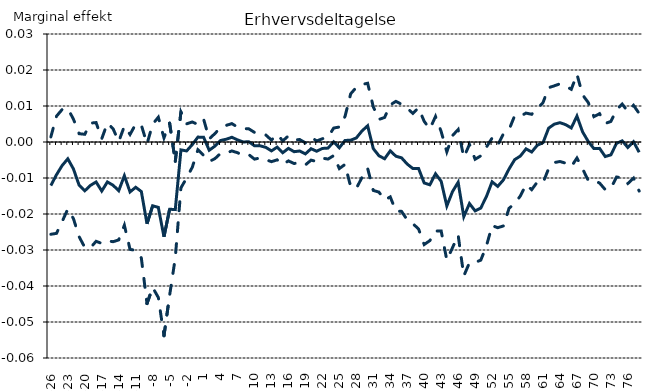
| Category | Estimat | Nedre konfidensgrænse | Øvre konfidensgrænse |
|---|---|---|---|
| -26.0 | -0.012 | -0.026 | 0.001 |
| -25.0 | -0.009 | -0.025 | 0.007 |
| -24.0 | -0.007 | -0.022 | 0.009 |
| -23.0 | -0.005 | -0.019 | 0.009 |
| -22.0 | -0.007 | -0.021 | 0.006 |
| -21.0 | -0.012 | -0.026 | 0.002 |
| -20.0 | -0.014 | -0.029 | 0.002 |
| -19.0 | -0.012 | -0.029 | 0.005 |
| -18.0 | -0.011 | -0.028 | 0.005 |
| -17.0 | -0.014 | -0.028 | 0.001 |
| -16.0 | -0.011 | -0.027 | 0.005 |
| -15.0 | -0.012 | -0.028 | 0.004 |
| -14.0 | -0.014 | -0.027 | 0 |
| -13.0 | -0.009 | -0.023 | 0.004 |
| -12.0 | -0.014 | -0.03 | 0.002 |
| -11.0 | -0.013 | -0.03 | 0.005 |
| -10.0 | -0.014 | -0.032 | 0.005 |
| -9.0 | -0.023 | -0.045 | -0.001 |
| -8.0 | -0.018 | -0.04 | 0.005 |
| -7.0 | -0.018 | -0.043 | 0.007 |
| -6.0 | -0.026 | -0.054 | 0.001 |
| -5.0 | -0.019 | -0.043 | 0.005 |
| -4.0 | -0.019 | -0.032 | -0.005 |
| -3.0 | -0.002 | -0.013 | 0.008 |
| -2.0 | -0.002 | -0.01 | 0.005 |
| -1.0 | -0.001 | -0.007 | 0.006 |
| 0.0 | 0.001 | -0.002 | 0.005 |
| 1.0 | 0.001 | -0.004 | 0.006 |
| 2.0 | -0.002 | -0.005 | 0.001 |
| 3.0 | -0.001 | -0.005 | 0.002 |
| 4.0 | 0 | -0.003 | 0.004 |
| 5.0 | 0.001 | -0.003 | 0.005 |
| 6.0 | 0.001 | -0.002 | 0.005 |
| 7.0 | 0.001 | -0.003 | 0.004 |
| 8.0 | 0 | -0.004 | 0.004 |
| 9.0 | 0 | -0.004 | 0.004 |
| 10.0 | -0.001 | -0.005 | 0.003 |
| 11.0 | -0.001 | -0.004 | 0.002 |
| 12.0 | -0.001 | -0.005 | 0.002 |
| 13.0 | -0.002 | -0.005 | 0.001 |
| 14.0 | -0.001 | -0.005 | 0.002 |
| 15.0 | -0.003 | -0.006 | 0 |
| 16.0 | -0.002 | -0.005 | 0.002 |
| 17.0 | -0.003 | -0.006 | 0.001 |
| 18.0 | -0.002 | -0.006 | 0.001 |
| 19.0 | -0.003 | -0.006 | 0 |
| 20.0 | -0.002 | -0.005 | 0.001 |
| 21.0 | -0.003 | -0.005 | 0 |
| 22.0 | -0.002 | -0.004 | 0.001 |
| 23.0 | -0.002 | -0.005 | 0.001 |
| 24.0 | 0 | -0.004 | 0.004 |
| 25.0 | -0.002 | -0.007 | 0.004 |
| 26.0 | 0 | -0.006 | 0.007 |
| 27.0 | 0 | -0.012 | 0.013 |
| 28.0 | 0.001 | -0.013 | 0.015 |
| 29.0 | 0.003 | -0.01 | 0.016 |
| 30.0 | 0.005 | -0.007 | 0.016 |
| 31.0 | -0.002 | -0.013 | 0.01 |
| 32.0 | -0.004 | -0.014 | 0.006 |
| 33.0 | -0.005 | -0.016 | 0.007 |
| 34.0 | -0.002 | -0.015 | 0.01 |
| 35.0 | -0.004 | -0.019 | 0.011 |
| 36.0 | -0.004 | -0.019 | 0.01 |
| 37.0 | -0.006 | -0.022 | 0.009 |
| 38.0 | -0.007 | -0.023 | 0.008 |
| 39.0 | -0.007 | -0.024 | 0.009 |
| 40.0 | -0.011 | -0.028 | 0.006 |
| 41.0 | -0.012 | -0.027 | 0.004 |
| 42.0 | -0.009 | -0.025 | 0.007 |
| 43.0 | -0.011 | -0.025 | 0.003 |
| 44.0 | -0.018 | -0.033 | -0.003 |
| 45.0 | -0.014 | -0.029 | 0.002 |
| 46.0 | -0.011 | -0.026 | 0.003 |
| 47.0 | -0.021 | -0.037 | -0.004 |
| 48.0 | -0.017 | -0.034 | -0.001 |
| 49.0 | -0.019 | -0.033 | -0.005 |
| 50.0 | -0.018 | -0.033 | -0.004 |
| 51.0 | -0.015 | -0.029 | -0.001 |
| 52.0 | -0.011 | -0.023 | 0.001 |
| 53.0 | -0.012 | -0.024 | -0.001 |
| 54.0 | -0.011 | -0.023 | 0.002 |
| 55.0 | -0.007 | -0.018 | 0.003 |
| 56.0 | -0.005 | -0.017 | 0.007 |
| 57.0 | -0.004 | -0.015 | 0.007 |
| 58.0 | -0.002 | -0.012 | 0.008 |
| 59.0 | -0.003 | -0.013 | 0.008 |
| 60.0 | -0.001 | -0.011 | 0.009 |
| 61.0 | 0 | -0.011 | 0.011 |
| 62.0 | 0.004 | -0.007 | 0.015 |
| 63.0 | 0.005 | -0.006 | 0.016 |
| 64.0 | 0.005 | -0.005 | 0.016 |
| 65.0 | 0.005 | -0.006 | 0.016 |
| 66.0 | 0.004 | -0.007 | 0.015 |
| 67.0 | 0.007 | -0.004 | 0.019 |
| 68.0 | 0.003 | -0.007 | 0.013 |
| 69.0 | 0 | -0.011 | 0.011 |
| 70.0 | -0.002 | -0.011 | 0.007 |
| 71.0 | -0.002 | -0.011 | 0.008 |
| 72.0 | -0.004 | -0.013 | 0.005 |
| 73.0 | -0.004 | -0.013 | 0.006 |
| 74.0 | 0 | -0.01 | 0.009 |
| 75.0 | 0 | -0.01 | 0.011 |
| 76.0 | -0.002 | -0.012 | 0.008 |
| 77.0 | 0 | -0.01 | 0.01 |
| 78.0 | -0.003 | -0.014 | 0.008 |